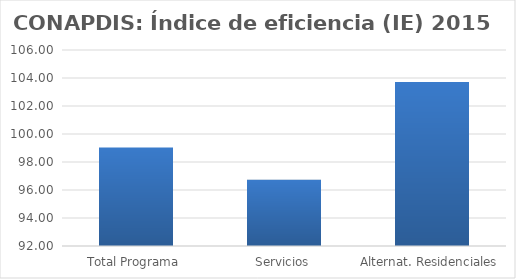
| Category | Índice de eficiencia (IE)  |
|---|---|
| Total Programa | 99.039 |
| Servicios | 96.734 |
| Alternat. Residenciales | 103.717 |